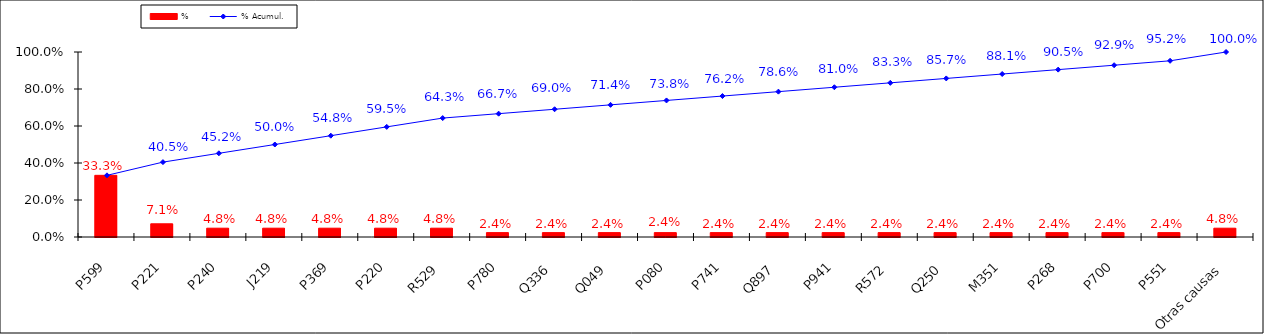
| Category | % |
|---|---|
| P599 | 0.333 |
| P221 | 0.071 |
| P240 | 0.048 |
| J219 | 0.048 |
| P369 | 0.048 |
| P220 | 0.048 |
| R529 | 0.048 |
| P780 | 0.024 |
| Q336 | 0.024 |
| Q049 | 0.024 |
| P080 | 0.024 |
| P741 | 0.024 |
| Q897 | 0.024 |
| P941 | 0.024 |
| R572 | 0.024 |
| Q250 | 0.024 |
| M351 | 0.024 |
| P268 | 0.024 |
| P700 | 0.024 |
| P551 | 0.024 |
| Otras causas | 0.048 |